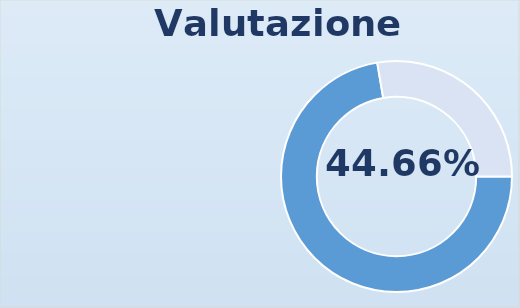
| Category | Series 0 |
|---|---|
| 0 | 1.447 |
| 1 | 0.553 |